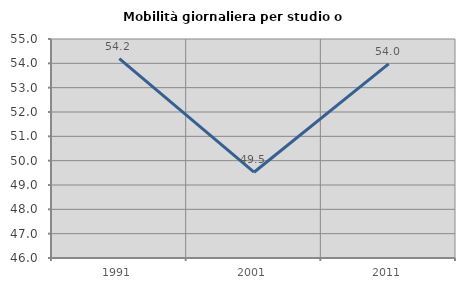
| Category | Mobilità giornaliera per studio o lavoro |
|---|---|
| 1991.0 | 54.194 |
| 2001.0 | 49.526 |
| 2011.0 | 53.981 |